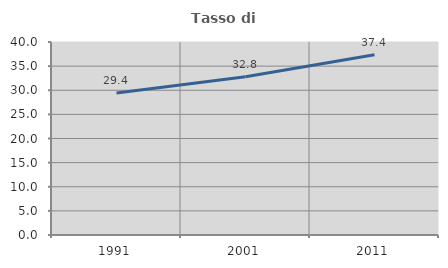
| Category | Tasso di occupazione   |
|---|---|
| 1991.0 | 29.431 |
| 2001.0 | 32.782 |
| 2011.0 | 37.374 |